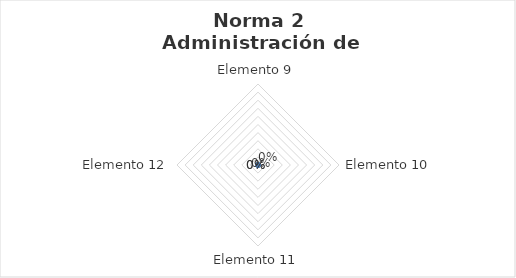
| Category | Series 0 |
|---|---|
| Elemento 9 | 0 |
| Elemento 10 | 0 |
| Elemento 11 | 0 |
| Elemento 12 | 0 |